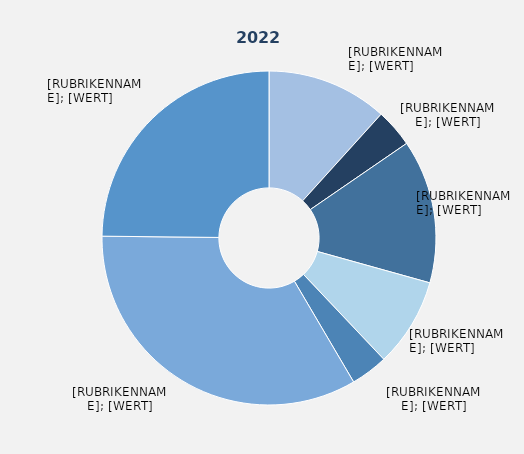
| Category | Series 1 |
|---|---|
| Produzierendes Gewerbe² ohne Baugewerbe | 11.7 |
| Baugewerbe | 3.7 |
| Handel | 13.9 |
| Verkehr und Lagerei | 8.6 |
| Gastgewerbe | 3.6 |
| Erbringung von Unternehmensdienstleistungen | 33.6 |
| Erbringung von öffentlichen und privaten Dienstleistungen | 24.8 |